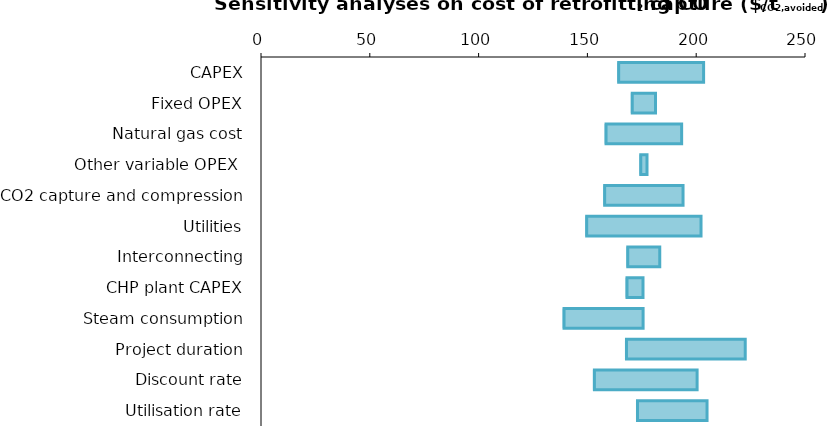
| Category | Minimum value | Increase of the parameter |
|---|---|---|
| CAPEX | 163.68 | 39.72 |
| Fixed OPEX | 169.922 | 11.347 |
| Natural gas cost | 157.881 | 35.429 |
| Other variable OPEX  | 173.848 | 3.496 |
| CO2 capture and compression | 157.242 | 36.707 |
| Utilities | 148.979 | 53.233 |
| Interconnecting | 167.887 | 15.417 |
| CHP plant CAPEX | 167.487 | 8.108 |
| Steam consumption | 138.574 | 37.022 |
| Project duration | 167.269 | 55.264 |
| Discount rate | 152.526 | 47.889 |
| Utilisation rate | 172.331 | 32.647 |